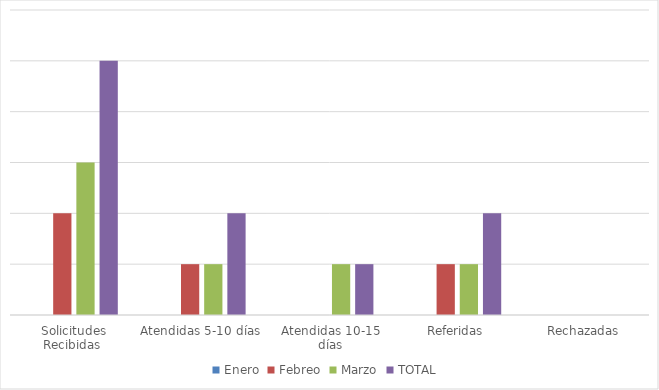
| Category | Enero | Febreo | Marzo | TOTAL  |
|---|---|---|---|---|
| Solicitudes Recibidas  | 0 | 2 | 3 | 5 |
| Atendidas 5-10 días | 0 | 1 | 1 | 2 |
| Atendidas 10-15 días | 0 | 0 | 1 | 1 |
| Referidas | 0 | 1 | 1 | 2 |
| Rechazadas | 0 | 0 | 0 | 0 |